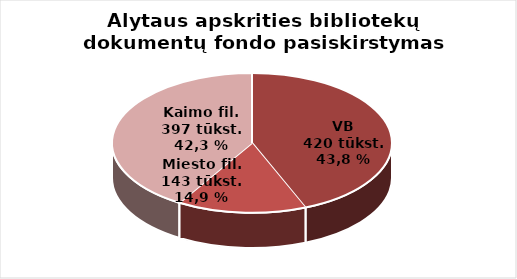
| Category | Series 0 |
|---|---|
| VB | 420327 |
| Miesto filialuose | 143003 |
| Kaimo filialuose | 397018 |